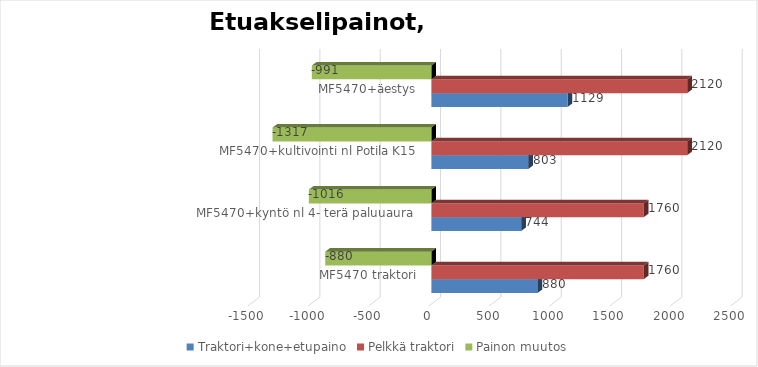
| Category | Traktori+kone+etupaino | Pelkkä traktori | Painon muutos |
|---|---|---|---|
| MF5470 traktori | 880 | 1760 | -880 |
| MF5470+kyntö nl 4- terä paluuaura  | 744.419 | 1760 | -1015.581 |
| MF5470+kultivointi nl Potila K15 | 803.258 | 2120 | -1316.742 |
| MF5470+äestys | 1129.101 | 2120 | -990.899 |